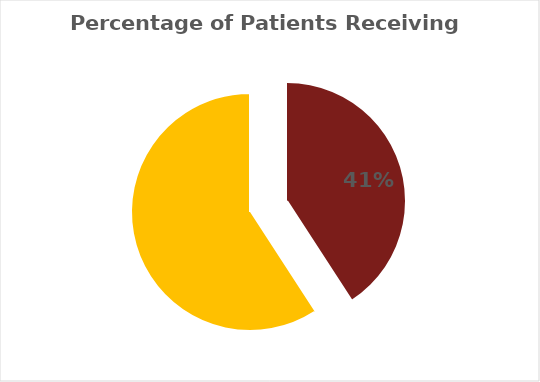
| Category | Series 0 |
|---|---|
| 0 | 0.408 |
| 1 | 0.592 |